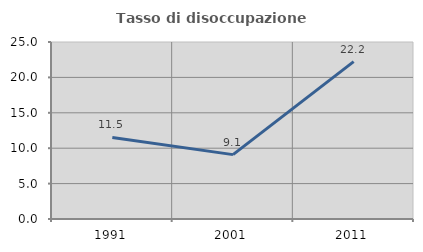
| Category | Tasso di disoccupazione giovanile  |
|---|---|
| 1991.0 | 11.526 |
| 2001.0 | 9.091 |
| 2011.0 | 22.222 |